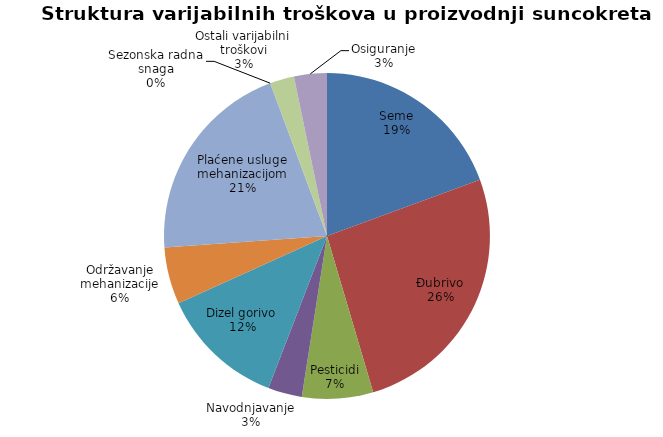
| Category | Series 0 |
|---|---|
| Seme | 12500 |
| Đubrivo | 16790 |
| Pesticidi | 4545 |
| Navodnjavanje | 2175 |
| Dizel gorivo | 7975 |
| Održavanje mehanizacije | 3639.167 |
| Plaćene usluge mehanizacijom | 13200 |
| Sezonska radna snaga | 0 |
| Ostali varijabilni troškovi | 1550 |
| Osiguranje | 2100 |